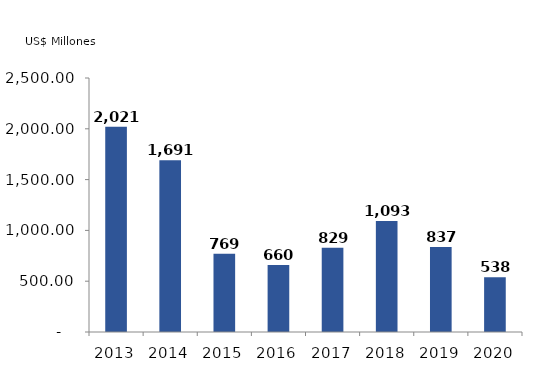
| Category | Series 0 |
|---|---|
| 2013.0 | 2020.94 |
| 2014.0 | 1690.63 |
| 2015.0 | 768.961 |
| 2016.0 | 660.255 |
| 2017.0 | 828.83 |
| 2018.0 | 1092.93 |
| 2019.0 | 837.19 |
| 2020.0 | 538.286 |